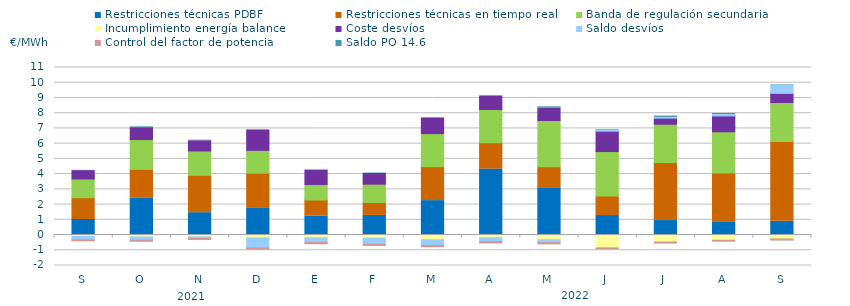
| Category | Restricciones técnicas PDBF | Restricciones técnicas en tiempo real | Banda de regulación secundaria | Incumplimiento energía balance | Coste desvíos | Saldo desvíos | Control del factor de potencia | Saldo PO 14.6 |
|---|---|---|---|---|---|---|---|---|
| S | 1.02 | 1.43 | 1.23 | -0.09 | 0.55 | -0.23 | -0.06 | 0.02 |
| O | 2.44 | 1.87 | 1.96 | -0.13 | 0.78 | -0.21 | -0.07 | 0.05 |
| N | 1.47 | 2.45 | 1.6 | -0.12 | 0.67 | -0.09 | -0.08 | 0.04 |
| D | 1.79 | 2.27 | 1.5 | -0.19 | 1.31 | -0.66 | -0.08 | 0.05 |
| E | 1.25 | 1.05 | 1.02 | -0.18 | 0.92 | -0.31 | -0.08 | 0.04 |
| F | 1.29 | 0.85 | 1.2 | -0.2 | 0.7 | -0.41 | -0.07 | 0.03 |
| M | 2.26 | 2.23 | 2.17 | -0.31 | 1.03 | -0.38 | -0.08 | 0 |
| A | 4.33 | 1.73 | 2.18 | -0.18 | 0.86 | -0.25 | -0.09 | 0.05 |
| M | 3.1 | 1.39 | 3.03 | -0.31 | 0.81 | -0.19 | -0.08 | 0.09 |
| J | 1.28 | 1.28 | 2.92 | -0.84 | 1.34 | 0.05 | -0.07 | 0.04 |
| J | 0.95 | 3.81 | 2.514 | -0.46 | 0.4 | 0.05 | -0.07 | 0.09 |
| A | 0.87 | 3.21 | 2.7 | -0.34 | 1.04 | 0.09 | -0.06 | 0.07 |
| S | 0.9 | 5.24 | 2.56 | -0.26 | 0.6 | 0.54 | -0.07 | 0.03 |